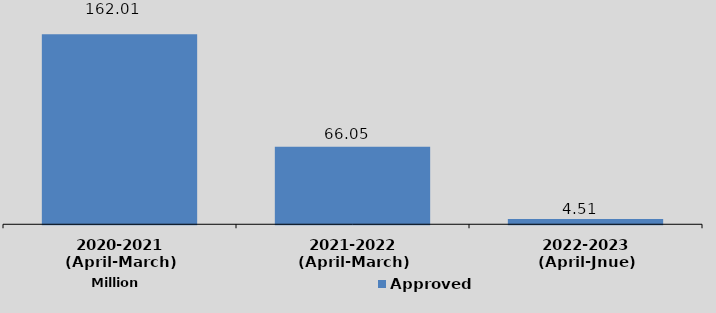
| Category | Approved Amount |
|---|---|
| 2020-2021
(April-March) | 162.01 |
| 2021-2022
(April-March)
 | 66.05 |
| 2022-2023
(April-Jnue)
 | 4.51 |